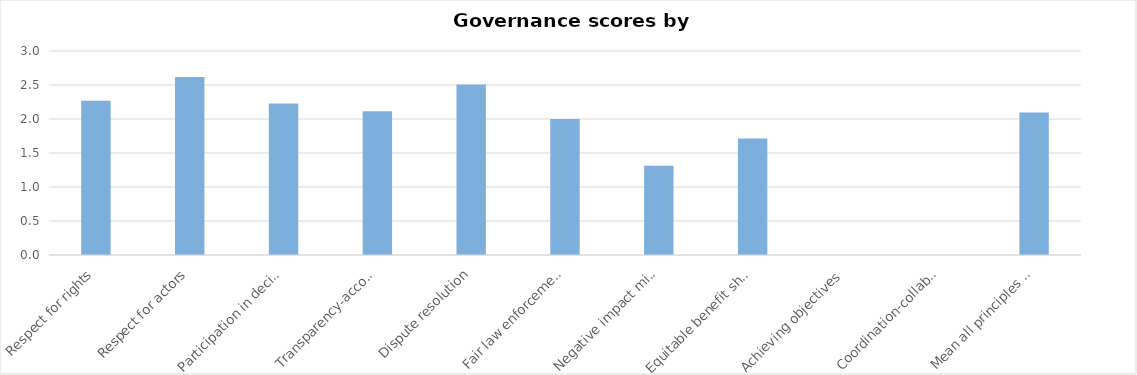
| Category | Mean |
|---|---|
| Respect for rights | 2.267 |
| Respect for actors | 2.619 |
| Participation in decisions | 2.229 |
| Transparency-accountability | 2.114 |
| Dispute resolution | 2.507 |
| Fair law enforcement | 2 |
| Negative impact mitigation | 1.314 |
| Equitable benefit sharing | 1.714 |
| Achieving objectives | 0 |
| Coordination-collaboration | 0 |
| Mean all principles assessed | 2.096 |